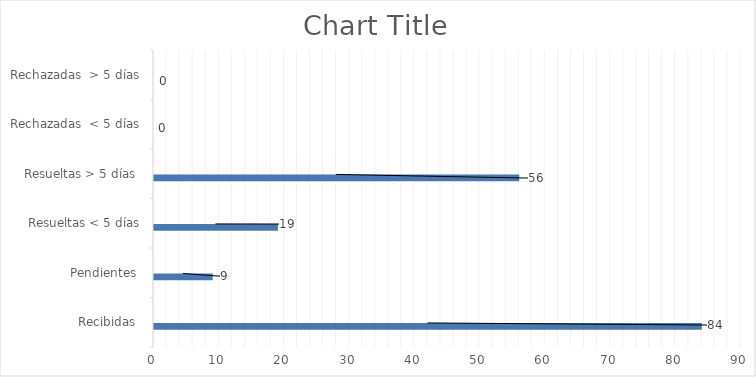
| Category | Física | PORTAL SAIP | 311 | Otras |
|---|---|---|---|---|
| Recibidas  | 0 | 84 | 0 | 0 |
| Pendientes  | 0 | 9 | 0 | 0 |
| Resueltas < 5 días | 0 | 19 | 0 | 0 |
| Resueltas > 5 días  | 0 | 56 | 0 | 0 |
| Rechazadas  < 5 días | 0 | 0 | 0 | 0 |
| Rechazadas  > 5 días | 0 | 0 | 0 | 0 |